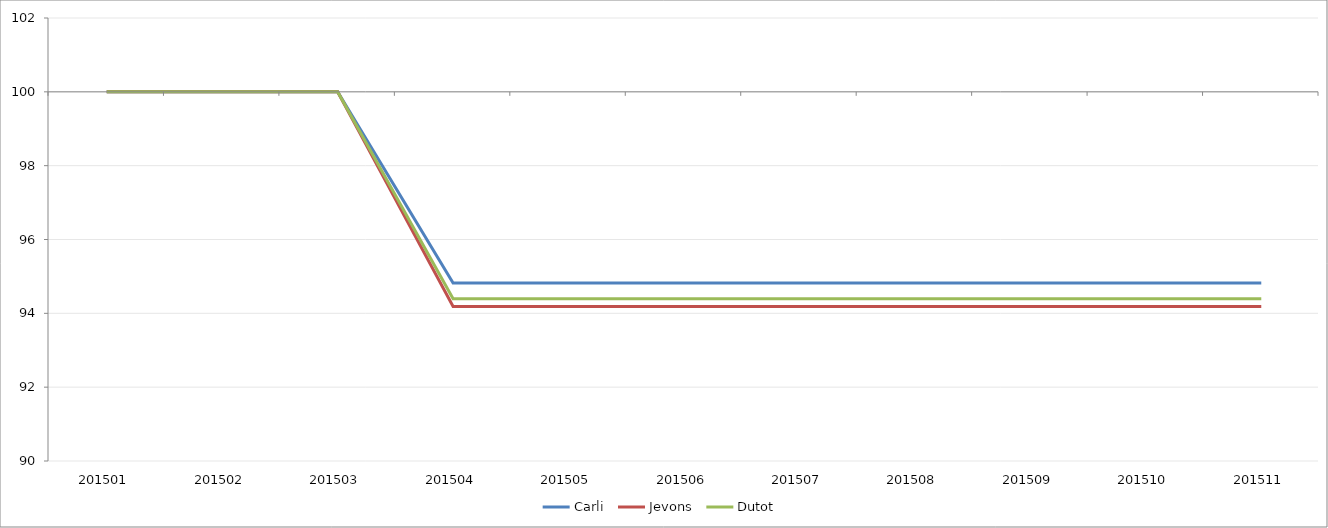
| Category | Carli | Jevons | Dutot |
|---|---|---|---|
| 201501.0 | 100 | 100 | 100 |
| 201502.0 | 100 | 100 | 100 |
| 201503.0 | 100 | 100 | 100 |
| 201504.0 | 94.822 | 94.184 | 94.394 |
| 201505.0 | 94.822 | 94.184 | 94.394 |
| 201506.0 | 94.822 | 94.184 | 94.394 |
| 201507.0 | 94.822 | 94.184 | 94.394 |
| 201508.0 | 94.822 | 94.184 | 94.394 |
| 201509.0 | 94.822 | 94.184 | 94.394 |
| 201510.0 | 94.822 | 94.184 | 94.394 |
| 201511.0 | 94.822 | 94.184 | 94.394 |